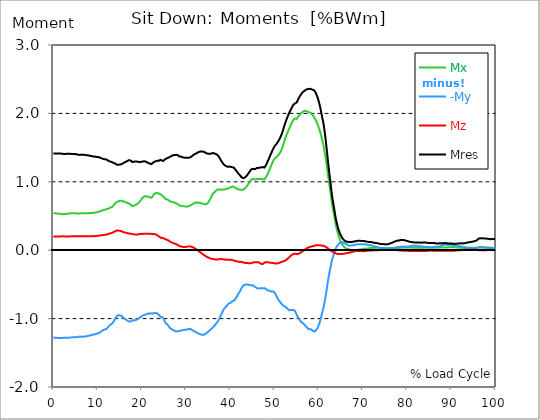
| Category |  Mx |  -My |  Mz |  Mres |
|---|---|---|---|---|
| 0.0 | 0.541 | -1.276 | 0.201 | 1.412 |
| 0.167348456675344 | 0.541 | -1.279 | 0.201 | 1.413 |
| 0.334696913350688 | 0.539 | -1.279 | 0.201 | 1.413 |
| 0.5020453700260321 | 0.538 | -1.28 | 0.201 | 1.413 |
| 0.669393826701376 | 0.538 | -1.279 | 0.201 | 1.412 |
| 0.83674228337672 | 0.538 | -1.28 | 0.201 | 1.413 |
| 1.0040907400520642 | 0.537 | -1.284 | 0.201 | 1.415 |
| 1.1621420602454444 | 0.534 | -1.284 | 0.201 | 1.415 |
| 1.3294905169207885 | 0.534 | -1.284 | 0.201 | 1.414 |
| 1.4968389735961325 | 0.533 | -1.284 | 0.201 | 1.414 |
| 1.6641874302714765 | 0.531 | -1.284 | 0.201 | 1.413 |
| 1.8315358869468206 | 0.527 | -1.284 | 0.201 | 1.412 |
| 1.9988843436221646 | 0.526 | -1.283 | 0.203 | 1.409 |
| 2.1662328002975086 | 0.526 | -1.281 | 0.203 | 1.408 |
| 2.333581256972853 | 0.528 | -1.281 | 0.203 | 1.408 |
| 2.5009297136481967 | 0.529 | -1.28 | 0.201 | 1.408 |
| 2.6682781703235405 | 0.529 | -1.279 | 0.201 | 1.407 |
| 2.8356266269988843 | 0.531 | -1.279 | 0.2 | 1.408 |
| 3.002975083674229 | 0.532 | -1.281 | 0.2 | 1.409 |
| 3.1703235403495724 | 0.534 | -1.28 | 0.2 | 1.409 |
| 3.337671997024917 | 0.534 | -1.279 | 0.201 | 1.409 |
| 3.4957233172182973 | 0.537 | -1.279 | 0.201 | 1.409 |
| 3.663071773893641 | 0.538 | -1.279 | 0.201 | 1.409 |
| 3.8304202305689854 | 0.539 | -1.278 | 0.201 | 1.408 |
| 3.997768687244329 | 0.541 | -1.275 | 0.203 | 1.408 |
| 4.165117143919673 | 0.542 | -1.274 | 0.203 | 1.407 |
| 4.332465600595017 | 0.541 | -1.273 | 0.203 | 1.405 |
| 4.499814057270361 | 0.541 | -1.273 | 0.203 | 1.404 |
| 4.667162513945706 | 0.539 | -1.274 | 0.203 | 1.405 |
| 4.834510970621049 | 0.539 | -1.274 | 0.203 | 1.405 |
| 5.001859427296393 | 0.538 | -1.274 | 0.203 | 1.405 |
| 5.169207883971737 | 0.537 | -1.274 | 0.203 | 1.404 |
| 5.336556340647081 | 0.537 | -1.27 | 0.203 | 1.4 |
| 5.503904797322425 | 0.536 | -1.267 | 0.204 | 1.398 |
| 5.671253253997769 | 0.536 | -1.265 | 0.204 | 1.396 |
| 5.82930457419115 | 0.536 | -1.264 | 0.203 | 1.394 |
| 5.996653030866494 | 0.536 | -1.263 | 0.203 | 1.393 |
| 6.164001487541838 | 0.539 | -1.263 | 0.203 | 1.394 |
| 6.331349944217181 | 0.541 | -1.264 | 0.203 | 1.397 |
| 6.498698400892526 | 0.541 | -1.265 | 0.204 | 1.398 |
| 6.66604685756787 | 0.539 | -1.264 | 0.204 | 1.396 |
| 6.833395314243213 | 0.539 | -1.263 | 0.204 | 1.394 |
| 7.000743770918558 | 0.539 | -1.264 | 0.204 | 1.396 |
| 7.168092227593902 | 0.538 | -1.262 | 0.204 | 1.393 |
| 7.335440684269246 | 0.539 | -1.257 | 0.204 | 1.389 |
| 7.50278914094459 | 0.541 | -1.256 | 0.204 | 1.388 |
| 7.6701375976199335 | 0.542 | -1.257 | 0.204 | 1.389 |
| 7.837486054295278 | 0.542 | -1.256 | 0.204 | 1.388 |
| 7.995537374488658 | 0.542 | -1.251 | 0.204 | 1.385 |
| 8.162885831164003 | 0.543 | -1.246 | 0.204 | 1.381 |
| 8.330234287839346 | 0.543 | -1.244 | 0.204 | 1.38 |
| 8.49758274451469 | 0.544 | -1.246 | 0.203 | 1.381 |
| 8.664931201190035 | 0.544 | -1.242 | 0.204 | 1.377 |
| 8.832279657865378 | 0.544 | -1.236 | 0.205 | 1.372 |
| 8.999628114540721 | 0.545 | -1.232 | 0.206 | 1.369 |
| 9.166976571216066 | 0.548 | -1.233 | 0.205 | 1.371 |
| 9.334325027891412 | 0.549 | -1.233 | 0.205 | 1.371 |
| 9.501673484566755 | 0.55 | -1.229 | 0.206 | 1.367 |
| 9.669021941242098 | 0.553 | -1.222 | 0.209 | 1.364 |
| 9.836370397917442 | 0.557 | -1.219 | 0.21 | 1.361 |
| 10.003718854592787 | 0.56 | -1.216 | 0.21 | 1.361 |
| 10.17106731126813 | 0.563 | -1.215 | 0.211 | 1.361 |
| 10.329118631461512 | 0.564 | -1.213 | 0.213 | 1.36 |
| 10.496467088136853 | 0.568 | -1.204 | 0.215 | 1.354 |
| 10.663815544812199 | 0.571 | -1.195 | 0.216 | 1.349 |
| 10.831164001487544 | 0.576 | -1.189 | 0.217 | 1.346 |
| 10.998512458162887 | 0.58 | -1.182 | 0.22 | 1.342 |
| 11.16586091483823 | 0.584 | -1.174 | 0.221 | 1.338 |
| 11.333209371513574 | 0.587 | -1.166 | 0.224 | 1.333 |
| 11.50055782818892 | 0.59 | -1.165 | 0.224 | 1.332 |
| 11.667906284864264 | 0.593 | -1.158 | 0.225 | 1.329 |
| 11.835254741539607 | 0.597 | -1.156 | 0.225 | 1.329 |
| 12.00260319821495 | 0.598 | -1.15 | 0.229 | 1.327 |
| 12.169951654890292 | 0.601 | -1.141 | 0.231 | 1.319 |
| 12.337300111565641 | 0.606 | -1.129 | 0.235 | 1.312 |
| 12.504648568240984 | 0.612 | -1.114 | 0.238 | 1.306 |
| 12.662699888434362 | 0.617 | -1.101 | 0.242 | 1.3 |
| 12.830048345109708 | 0.62 | -1.092 | 0.244 | 1.295 |
| 12.997396801785053 | 0.627 | -1.086 | 0.248 | 1.294 |
| 13.164745258460396 | 0.631 | -1.079 | 0.251 | 1.29 |
| 13.33209371513574 | 0.635 | -1.069 | 0.256 | 1.285 |
| 13.499442171811083 | 0.644 | -1.054 | 0.262 | 1.28 |
| 13.666790628486426 | 0.66 | -1.036 | 0.268 | 1.274 |
| 13.834139085161771 | 0.676 | -1.018 | 0.273 | 1.27 |
| 14.001487541837117 | 0.687 | -1.001 | 0.278 | 1.265 |
| 14.16883599851246 | 0.695 | -0.982 | 0.283 | 1.257 |
| 14.336184455187803 | 0.701 | -0.964 | 0.287 | 1.251 |
| 14.503532911863147 | 0.71 | -0.952 | 0.287 | 1.248 |
| 14.670881368538492 | 0.715 | -0.951 | 0.289 | 1.249 |
| 14.828932688731873 | 0.719 | -0.95 | 0.289 | 1.251 |
| 14.996281145407215 | 0.721 | -0.952 | 0.283 | 1.252 |
| 15.163629602082558 | 0.722 | -0.948 | 0.284 | 1.252 |
| 15.330978058757903 | 0.72 | -0.957 | 0.28 | 1.256 |
| 15.498326515433247 | 0.72 | -0.964 | 0.275 | 1.259 |
| 15.665674972108594 | 0.719 | -0.977 | 0.269 | 1.267 |
| 15.833023428783937 | 0.713 | -0.99 | 0.262 | 1.276 |
| 16.00037188545928 | 0.709 | -0.998 | 0.26 | 1.281 |
| 16.167720342134626 | 0.708 | -1.004 | 0.26 | 1.286 |
| 16.335068798809967 | 0.701 | -1.012 | 0.257 | 1.29 |
| 16.502417255485312 | 0.698 | -1.016 | 0.254 | 1.295 |
| 16.669765712160658 | 0.693 | -1.027 | 0.251 | 1.302 |
| 16.837114168836 | 0.688 | -1.036 | 0.248 | 1.308 |
| 17.004462625511344 | 0.686 | -1.039 | 0.246 | 1.313 |
| 17.16251394570472 | 0.681 | -1.045 | 0.243 | 1.318 |
| 17.32986240238007 | 0.673 | -1.043 | 0.242 | 1.313 |
| 17.497210859055414 | 0.666 | -1.041 | 0.241 | 1.308 |
| 17.664559315730756 | 0.658 | -1.037 | 0.24 | 1.303 |
| 17.8319077724061 | 0.645 | -1.027 | 0.235 | 1.289 |
| 17.999256229081443 | 0.644 | -1.023 | 0.233 | 1.289 |
| 18.166604685756788 | 0.649 | -1.026 | 0.233 | 1.292 |
| 18.333953142432133 | 0.656 | -1.027 | 0.231 | 1.296 |
| 18.501301599107478 | 0.661 | -1.022 | 0.231 | 1.297 |
| 18.668650055782823 | 0.666 | -1.02 | 0.23 | 1.296 |
| 18.835998512458165 | 0.67 | -1.017 | 0.227 | 1.296 |
| 19.00334696913351 | 0.676 | -1.011 | 0.23 | 1.295 |
| 19.170695425808855 | 0.686 | -1.002 | 0.232 | 1.292 |
| 19.338043882484197 | 0.695 | -0.993 | 0.235 | 1.29 |
| 19.496095202677576 | 0.706 | -0.982 | 0.237 | 1.287 |
| 19.66344365935292 | 0.716 | -0.979 | 0.236 | 1.29 |
| 19.830792116028263 | 0.735 | -0.972 | 0.238 | 1.292 |
| 19.998140572703612 | 0.754 | -0.964 | 0.24 | 1.294 |
| 20.165489029378953 | 0.764 | -0.958 | 0.24 | 1.296 |
| 20.3328374860543 | 0.774 | -0.952 | 0.238 | 1.299 |
| 20.500185942729644 | 0.785 | -0.947 | 0.24 | 1.301 |
| 20.667534399404985 | 0.79 | -0.945 | 0.24 | 1.301 |
| 20.83488285608033 | 0.791 | -0.941 | 0.241 | 1.296 |
| 21.002231312755672 | 0.789 | -0.936 | 0.24 | 1.29 |
| 21.16957976943102 | 0.786 | -0.93 | 0.241 | 1.284 |
| 21.336928226106362 | 0.783 | -0.928 | 0.242 | 1.279 |
| 21.504276682781704 | 0.781 | -0.926 | 0.242 | 1.276 |
| 21.67162513945705 | 0.779 | -0.925 | 0.242 | 1.27 |
| 21.82967645965043 | 0.771 | -0.925 | 0.241 | 1.264 |
| 21.997024916325774 | 0.765 | -0.924 | 0.24 | 1.259 |
| 22.16437337300112 | 0.764 | -0.924 | 0.24 | 1.258 |
| 22.33172182967646 | 0.775 | -0.928 | 0.237 | 1.267 |
| 22.499070286351806 | 0.794 | -0.926 | 0.236 | 1.278 |
| 22.666418743027148 | 0.816 | -0.921 | 0.236 | 1.29 |
| 22.833767199702496 | 0.824 | -0.916 | 0.237 | 1.294 |
| 23.00111565637784 | 0.83 | -0.915 | 0.233 | 1.297 |
| 23.168464113053183 | 0.835 | -0.918 | 0.23 | 1.301 |
| 23.335812569728528 | 0.839 | -0.92 | 0.226 | 1.305 |
| 23.50316102640387 | 0.839 | -0.925 | 0.22 | 1.308 |
| 23.670509483079215 | 0.834 | -0.935 | 0.21 | 1.31 |
| 23.83785793975456 | 0.828 | -0.936 | 0.204 | 1.306 |
| 23.995909259947936 | 0.821 | -0.951 | 0.197 | 1.311 |
| 24.163257716623285 | 0.821 | -0.972 | 0.188 | 1.321 |
| 24.330606173298627 | 0.816 | -0.983 | 0.181 | 1.323 |
| 24.49795462997397 | 0.805 | -0.978 | 0.178 | 1.313 |
| 24.665303086649313 | 0.791 | -0.979 | 0.177 | 1.305 |
| 24.83265154332466 | 0.781 | -0.989 | 0.176 | 1.305 |
| 25.0 | 0.775 | -1.009 | 0.173 | 1.313 |
| 25.167348456675345 | 0.762 | -1.041 | 0.165 | 1.326 |
| 25.334696913350694 | 0.751 | -1.059 | 0.16 | 1.333 |
| 25.502045370026035 | 0.748 | -1.072 | 0.156 | 1.339 |
| 25.669393826701377 | 0.744 | -1.079 | 0.154 | 1.342 |
| 25.836742283376722 | 0.74 | -1.09 | 0.149 | 1.346 |
| 26.004090740052067 | 0.733 | -1.103 | 0.144 | 1.353 |
| 26.17143919672741 | 0.724 | -1.119 | 0.136 | 1.359 |
| 26.329490516920792 | 0.715 | -1.134 | 0.128 | 1.365 |
| 26.49683897359613 | 0.711 | -1.143 | 0.12 | 1.371 |
| 26.66418743027148 | 0.709 | -1.151 | 0.115 | 1.376 |
| 26.831535886946828 | 0.706 | -1.158 | 0.112 | 1.381 |
| 26.998884343622166 | 0.705 | -1.166 | 0.107 | 1.386 |
| 27.166232800297514 | 0.703 | -1.171 | 0.103 | 1.389 |
| 27.333581256972852 | 0.698 | -1.176 | 0.098 | 1.389 |
| 27.5009297136482 | 0.692 | -1.181 | 0.095 | 1.392 |
| 27.668278170323543 | 0.688 | -1.186 | 0.091 | 1.394 |
| 27.835626626998888 | 0.686 | -1.188 | 0.087 | 1.394 |
| 28.002975083674233 | 0.679 | -1.188 | 0.081 | 1.392 |
| 28.170323540349575 | 0.671 | -1.188 | 0.075 | 1.387 |
| 28.33767199702492 | 0.661 | -1.181 | 0.068 | 1.376 |
| 28.50502045370026 | 0.655 | -1.177 | 0.061 | 1.37 |
| 28.663071773893645 | 0.651 | -1.177 | 0.057 | 1.369 |
| 28.830420230568986 | 0.651 | -1.177 | 0.054 | 1.369 |
| 28.99776868724433 | 0.649 | -1.174 | 0.053 | 1.365 |
| 29.165117143919673 | 0.645 | -1.17 | 0.049 | 1.359 |
| 29.33246560059502 | 0.643 | -1.166 | 0.048 | 1.355 |
| 29.499814057270367 | 0.641 | -1.165 | 0.047 | 1.354 |
| 29.66716251394571 | 0.641 | -1.163 | 0.047 | 1.353 |
| 29.834510970621054 | 0.639 | -1.163 | 0.048 | 1.353 |
| 30.00185942729639 | 0.636 | -1.162 | 0.049 | 1.351 |
| 30.169207883971744 | 0.636 | -1.161 | 0.05 | 1.351 |
| 30.33655634064708 | 0.638 | -1.157 | 0.053 | 1.351 |
| 30.50390479732243 | 0.643 | -1.154 | 0.055 | 1.35 |
| 30.671253253997772 | 0.646 | -1.151 | 0.057 | 1.351 |
| 30.829304574191156 | 0.651 | -1.152 | 0.055 | 1.355 |
| 30.996653030866494 | 0.656 | -1.154 | 0.054 | 1.359 |
| 31.164001487541842 | 0.662 | -1.16 | 0.052 | 1.366 |
| 31.331349944217187 | 0.667 | -1.166 | 0.048 | 1.373 |
| 31.498698400892525 | 0.674 | -1.172 | 0.044 | 1.383 |
| 31.666046857567874 | 0.682 | -1.179 | 0.039 | 1.392 |
| 31.833395314243212 | 0.689 | -1.186 | 0.034 | 1.4 |
| 32.00074377091856 | 0.692 | -1.19 | 0.027 | 1.405 |
| 32.1680922275939 | 0.695 | -1.195 | 0.02 | 1.412 |
| 32.33544068426925 | 0.697 | -1.201 | 0.012 | 1.416 |
| 32.50278914094459 | 0.694 | -1.208 | 0.004 | 1.423 |
| 32.670137597619934 | 0.695 | -1.214 | -0.004 | 1.429 |
| 32.83748605429528 | 0.695 | -1.22 | -0.012 | 1.435 |
| 33.004834510970625 | 0.695 | -1.226 | -0.02 | 1.44 |
| 33.162885831164004 | 0.692 | -1.23 | -0.028 | 1.441 |
| 33.33023428783935 | 0.688 | -1.232 | -0.036 | 1.442 |
| 33.497582744514695 | 0.684 | -1.236 | -0.044 | 1.443 |
| 33.664931201190036 | 0.681 | -1.237 | -0.052 | 1.442 |
| 33.83227965786538 | 0.678 | -1.237 | -0.06 | 1.441 |
| 33.99962811454073 | 0.674 | -1.237 | -0.068 | 1.44 |
| 34.16697657121607 | 0.672 | -1.235 | -0.075 | 1.436 |
| 34.33432502789141 | 0.672 | -1.226 | -0.082 | 1.428 |
| 34.50167348456676 | 0.672 | -1.219 | -0.088 | 1.42 |
| 34.6690219412421 | 0.677 | -1.21 | -0.096 | 1.415 |
| 34.83637039791744 | 0.684 | -1.201 | -0.102 | 1.413 |
| 35.00371885459279 | 0.695 | -1.193 | -0.107 | 1.41 |
| 35.17106731126814 | 0.713 | -1.183 | -0.112 | 1.408 |
| 35.338415767943474 | 0.732 | -1.173 | -0.115 | 1.408 |
| 35.49646708813686 | 0.753 | -1.166 | -0.119 | 1.412 |
| 35.6638155448122 | 0.773 | -1.154 | -0.123 | 1.412 |
| 35.831164001487544 | 0.796 | -1.143 | -0.125 | 1.415 |
| 35.998512458162885 | 0.818 | -1.131 | -0.128 | 1.419 |
| 36.165860914838234 | 0.835 | -1.12 | -0.13 | 1.421 |
| 36.333209371513576 | 0.845 | -1.111 | -0.133 | 1.418 |
| 36.50055782818892 | 0.851 | -1.098 | -0.134 | 1.412 |
| 36.667906284864266 | 0.866 | -1.085 | -0.136 | 1.409 |
| 36.83525474153961 | 0.877 | -1.071 | -0.136 | 1.404 |
| 37.002603198214956 | 0.882 | -1.057 | -0.136 | 1.396 |
| 37.1699516548903 | 0.887 | -1.042 | -0.136 | 1.387 |
| 37.337300111565646 | 0.887 | -1.025 | -0.134 | 1.373 |
| 37.50464856824098 | 0.887 | -1.006 | -0.131 | 1.359 |
| 37.66269988843437 | 0.888 | -0.984 | -0.13 | 1.343 |
| 37.83004834510971 | 0.886 | -0.958 | -0.13 | 1.322 |
| 37.99739680178505 | 0.885 | -0.934 | -0.13 | 1.302 |
| 38.16474525846039 | 0.887 | -0.912 | -0.13 | 1.286 |
| 38.33209371513574 | 0.887 | -0.888 | -0.133 | 1.27 |
| 38.49944217181109 | 0.886 | -0.866 | -0.134 | 1.254 |
| 38.666790628486424 | 0.888 | -0.854 | -0.135 | 1.247 |
| 38.83413908516178 | 0.891 | -0.839 | -0.136 | 1.238 |
| 39.001487541837115 | 0.892 | -0.826 | -0.138 | 1.231 |
| 39.16883599851246 | 0.893 | -0.816 | -0.139 | 1.226 |
| 39.336184455187805 | 0.899 | -0.801 | -0.14 | 1.222 |
| 39.503532911863154 | 0.905 | -0.787 | -0.141 | 1.219 |
| 39.670881368538495 | 0.909 | -0.778 | -0.141 | 1.216 |
| 39.83822982521384 | 0.916 | -0.781 | -0.141 | 1.225 |
| 39.996281145407224 | 0.918 | -0.773 | -0.141 | 1.22 |
| 40.163629602082565 | 0.921 | -0.762 | -0.14 | 1.216 |
| 40.33097805875791 | 0.926 | -0.753 | -0.141 | 1.215 |
| 40.498326515433256 | 0.93 | -0.744 | -0.144 | 1.214 |
| 40.6656749721086 | 0.931 | -0.738 | -0.149 | 1.21 |
| 40.83302342878393 | 0.926 | -0.736 | -0.152 | 1.205 |
| 41.00037188545929 | 0.915 | -0.73 | -0.155 | 1.193 |
| 41.16772034213463 | 0.908 | -0.709 | -0.16 | 1.176 |
| 41.33506879880997 | 0.903 | -0.694 | -0.161 | 1.163 |
| 41.50241725548531 | 0.898 | -0.677 | -0.162 | 1.15 |
| 41.66976571216066 | 0.893 | -0.656 | -0.165 | 1.134 |
| 41.837114168836 | 0.889 | -0.635 | -0.17 | 1.12 |
| 42.004462625511344 | 0.887 | -0.618 | -0.171 | 1.109 |
| 42.17181108218669 | 0.885 | -0.602 | -0.171 | 1.098 |
| 42.32986240238007 | 0.883 | -0.584 | -0.17 | 1.085 |
| 42.497210859055414 | 0.883 | -0.559 | -0.171 | 1.07 |
| 42.66455931573076 | 0.883 | -0.541 | -0.173 | 1.061 |
| 42.831907772406105 | 0.885 | -0.526 | -0.177 | 1.055 |
| 42.999256229081446 | 0.888 | -0.516 | -0.181 | 1.054 |
| 43.16660468575679 | 0.897 | -0.507 | -0.184 | 1.058 |
| 43.33395314243214 | 0.905 | -0.501 | -0.187 | 1.064 |
| 43.50130159910748 | 0.916 | -0.502 | -0.186 | 1.074 |
| 43.66865005578282 | 0.929 | -0.501 | -0.186 | 1.085 |
| 43.83599851245817 | 0.945 | -0.5 | -0.188 | 1.098 |
| 44.00334696913351 | 0.959 | -0.498 | -0.189 | 1.111 |
| 44.17069542580886 | 0.975 | -0.505 | -0.189 | 1.128 |
| 44.3380438824842 | 0.991 | -0.51 | -0.189 | 1.145 |
| 44.49609520267758 | 1.009 | -0.51 | -0.19 | 1.16 |
| 44.66344365935292 | 1.026 | -0.515 | -0.192 | 1.176 |
| 44.83079211602827 | 1.036 | -0.517 | -0.19 | 1.186 |
| 44.99814057270361 | 1.041 | -0.517 | -0.184 | 1.189 |
| 45.16548902937895 | 1.042 | -0.512 | -0.178 | 1.187 |
| 45.332837486054295 | 1.038 | -0.522 | -0.176 | 1.186 |
| 45.500185942729644 | 1.036 | -0.531 | -0.176 | 1.186 |
| 45.66753439940499 | 1.033 | -0.538 | -0.177 | 1.187 |
| 45.83488285608033 | 1.038 | -0.545 | -0.177 | 1.193 |
| 46.00223131275568 | 1.042 | -0.557 | -0.174 | 1.201 |
| 46.16957976943102 | 1.043 | -0.559 | -0.176 | 1.205 |
| 46.336928226106366 | 1.039 | -0.558 | -0.177 | 1.203 |
| 46.50427668278171 | 1.037 | -0.559 | -0.182 | 1.204 |
| 46.671625139457056 | 1.039 | -0.557 | -0.188 | 1.208 |
| 46.829676459650436 | 1.039 | -0.555 | -0.194 | 1.209 |
| 46.99702491632577 | 1.037 | -0.557 | -0.2 | 1.21 |
| 47.16437337300112 | 1.037 | -0.558 | -0.204 | 1.213 |
| 47.33172182967646 | 1.039 | -0.559 | -0.2 | 1.216 |
| 47.49907028635181 | 1.036 | -0.555 | -0.194 | 1.211 |
| 47.66641874302716 | 1.034 | -0.549 | -0.186 | 1.208 |
| 47.83376719970249 | 1.044 | -0.557 | -0.179 | 1.22 |
| 48.001115656377834 | 1.059 | -0.563 | -0.174 | 1.235 |
| 48.16846411305319 | 1.076 | -0.572 | -0.174 | 1.257 |
| 48.33581256972853 | 1.1 | -0.58 | -0.177 | 1.281 |
| 48.50316102640387 | 1.123 | -0.587 | -0.177 | 1.306 |
| 48.67050948307921 | 1.146 | -0.586 | -0.178 | 1.327 |
| 48.837857939754564 | 1.171 | -0.592 | -0.184 | 1.354 |
| 49.005206396429905 | 1.197 | -0.6 | -0.184 | 1.381 |
| 49.163257716623285 | 1.224 | -0.603 | -0.183 | 1.405 |
| 49.33060617329863 | 1.249 | -0.602 | -0.183 | 1.428 |
| 49.49795462997397 | 1.276 | -0.603 | -0.186 | 1.455 |
| 49.66530308664932 | 1.3 | -0.603 | -0.188 | 1.477 |
| 49.832651543324666 | 1.319 | -0.606 | -0.189 | 1.496 |
| 50.0 | 1.338 | -0.617 | -0.19 | 1.518 |
| 50.16734845667534 | 1.348 | -0.635 | -0.192 | 1.533 |
| 50.33469691335069 | 1.355 | -0.656 | -0.194 | 1.543 |
| 50.50204537002604 | 1.364 | -0.681 | -0.194 | 1.558 |
| 50.66939382670139 | 1.375 | -0.701 | -0.193 | 1.574 |
| 50.836742283376715 | 1.387 | -0.719 | -0.189 | 1.592 |
| 51.00409074005207 | 1.4 | -0.733 | -0.187 | 1.609 |
| 51.17143919672741 | 1.416 | -0.747 | -0.183 | 1.629 |
| 51.32949051692079 | 1.436 | -0.762 | -0.179 | 1.652 |
| 51.496838973596134 | 1.457 | -0.775 | -0.174 | 1.677 |
| 51.66418743027148 | 1.482 | -0.789 | -0.17 | 1.704 |
| 51.831535886946824 | 1.51 | -0.8 | -0.166 | 1.736 |
| 51.99888434362217 | 1.545 | -0.812 | -0.163 | 1.773 |
| 52.16623280029752 | 1.58 | -0.816 | -0.16 | 1.807 |
| 52.33358125697285 | 1.615 | -0.823 | -0.155 | 1.843 |
| 52.5009297136482 | 1.647 | -0.83 | -0.149 | 1.873 |
| 52.668278170323546 | 1.676 | -0.837 | -0.14 | 1.903 |
| 52.835626626998895 | 1.703 | -0.849 | -0.131 | 1.931 |
| 53.00297508367424 | 1.729 | -0.86 | -0.123 | 1.958 |
| 53.17032354034958 | 1.753 | -0.872 | -0.113 | 1.985 |
| 53.33767199702492 | 1.778 | -0.878 | -0.103 | 2.011 |
| 53.50502045370027 | 1.801 | -0.875 | -0.091 | 2.031 |
| 53.663071773893655 | 1.824 | -0.875 | -0.081 | 2.053 |
| 53.83042023056899 | 1.85 | -0.875 | -0.072 | 2.075 |
| 53.99776868724433 | 1.873 | -0.875 | -0.065 | 2.096 |
| 54.16511714391967 | 1.893 | -0.875 | -0.06 | 2.115 |
| 54.33246560059503 | 1.912 | -0.875 | -0.055 | 2.13 |
| 54.49981405727037 | 1.924 | -0.878 | -0.052 | 2.143 |
| 54.667162513945705 | 1.926 | -0.892 | -0.05 | 2.147 |
| 54.834510970621054 | 1.921 | -0.919 | -0.054 | 2.152 |
| 55.0018594272964 | 1.92 | -0.941 | -0.058 | 2.16 |
| 55.169207883971744 | 1.932 | -0.964 | -0.058 | 2.181 |
| 55.336556340647086 | 1.95 | -0.985 | -0.057 | 2.204 |
| 55.50390479732243 | 1.964 | -1.002 | -0.052 | 2.226 |
| 55.671253253997776 | 1.977 | -1.018 | -0.044 | 2.244 |
| 55.83860171067312 | 1.99 | -1.033 | -0.038 | 2.262 |
| 55.9966530308665 | 2.001 | -1.041 | -0.031 | 2.278 |
| 56.16400148754184 | 2.012 | -1.057 | -0.023 | 2.294 |
| 56.33134994421718 | 2.022 | -1.063 | -0.016 | 2.306 |
| 56.498698400892536 | 2.027 | -1.07 | -0.007 | 2.316 |
| 56.66604685756788 | 2.032 | -1.079 | 0.001 | 2.326 |
| 56.83339531424321 | 2.034 | -1.092 | 0.009 | 2.334 |
| 57.00074377091856 | 2.036 | -1.108 | 0.016 | 2.343 |
| 57.16809222759391 | 2.033 | -1.119 | 0.023 | 2.348 |
| 57.33544068426925 | 2.031 | -1.129 | 0.029 | 2.351 |
| 57.5027891409446 | 2.026 | -1.141 | 0.036 | 2.355 |
| 57.670137597619934 | 2.02 | -1.154 | 0.041 | 2.357 |
| 57.83748605429528 | 2.015 | -1.157 | 0.045 | 2.357 |
| 58.004834510970625 | 2.014 | -1.151 | 0.048 | 2.359 |
| 58.16288583116401 | 2.01 | -1.156 | 0.05 | 2.36 |
| 58.330234287839346 | 2 | -1.162 | 0.053 | 2.357 |
| 58.497582744514695 | 1.985 | -1.162 | 0.057 | 2.348 |
| 58.66493120119004 | 1.971 | -1.177 | 0.059 | 2.346 |
| 58.832279657865385 | 1.956 | -1.186 | 0.061 | 2.343 |
| 58.999628114540734 | 1.942 | -1.189 | 0.065 | 2.335 |
| 59.16697657121607 | 1.923 | -1.184 | 0.068 | 2.319 |
| 59.33432502789142 | 1.9 | -1.176 | 0.071 | 2.299 |
| 59.50167348456676 | 1.877 | -1.165 | 0.074 | 2.274 |
| 59.66902194124211 | 1.853 | -1.146 | 0.074 | 2.247 |
| 59.83637039791745 | 1.826 | -1.123 | 0.074 | 2.214 |
| 60.00371885459278 | 1.796 | -1.096 | 0.072 | 2.177 |
| 60.17106731126813 | 1.764 | -1.065 | 0.071 | 2.136 |
| 60.33841576794349 | 1.727 | -1.028 | 0.071 | 2.091 |
| 60.49646708813685 | 1.688 | -0.988 | 0.07 | 2.038 |
| 60.6638155448122 | 1.644 | -0.943 | 0.069 | 1.982 |
| 60.831164001487544 | 1.598 | -0.9 | 0.068 | 1.926 |
| 60.99851245816289 | 1.555 | -0.864 | 0.065 | 1.878 |
| 61.16586091483824 | 1.501 | -0.812 | 0.061 | 1.812 |
| 61.333209371513576 | 1.44 | -0.756 | 0.057 | 1.736 |
| 61.50055782818892 | 1.375 | -0.695 | 0.052 | 1.652 |
| 61.667906284864266 | 1.303 | -0.628 | 0.045 | 1.557 |
| 61.835254741539615 | 1.229 | -0.56 | 0.038 | 1.459 |
| 62.002603198214956 | 1.147 | -0.485 | 0.029 | 1.355 |
| 62.16995165489029 | 1.069 | -0.418 | 0.021 | 1.256 |
| 62.33730011156564 | 0.99 | -0.355 | 0.012 | 1.161 |
| 62.504648568240995 | 0.914 | -0.297 | 0.004 | 1.07 |
| 62.67199702491633 | 0.842 | -0.251 | -0.004 | 0.989 |
| 62.83004834510971 | 0.756 | -0.19 | -0.011 | 0.887 |
| 62.99739680178505 | 0.683 | -0.145 | -0.017 | 0.805 |
| 63.1647452584604 | 0.618 | -0.107 | -0.023 | 0.732 |
| 63.33209371513575 | 0.558 | -0.076 | -0.029 | 0.667 |
| 63.4994421718111 | 0.498 | -0.041 | -0.036 | 0.601 |
| 63.666790628486424 | 0.44 | -0.012 | -0.041 | 0.538 |
| 63.83413908516177 | 0.38 | 0.02 | -0.045 | 0.473 |
| 64.00148754183712 | 0.332 | 0.044 | -0.05 | 0.421 |
| 64.16883599851248 | 0.289 | 0.061 | -0.053 | 0.376 |
| 64.3361844551878 | 0.247 | 0.075 | -0.054 | 0.333 |
| 64.50353291186315 | 0.211 | 0.087 | -0.055 | 0.299 |
| 64.6708813685385 | 0.174 | 0.104 | -0.055 | 0.267 |
| 64.83822982521384 | 0.146 | 0.108 | -0.057 | 0.24 |
| 65.00557828188919 | 0.12 | 0.114 | -0.055 | 0.216 |
| 65.16362960208257 | 0.1 | 0.115 | -0.055 | 0.195 |
| 65.3309780587579 | 0.081 | 0.115 | -0.054 | 0.177 |
| 65.49832651543326 | 0.066 | 0.111 | -0.053 | 0.162 |
| 65.6656749721086 | 0.053 | 0.106 | -0.052 | 0.15 |
| 65.83302342878395 | 0.042 | 0.102 | -0.049 | 0.14 |
| 66.00037188545929 | 0.033 | 0.097 | -0.047 | 0.133 |
| 66.16772034213463 | 0.028 | 0.091 | -0.045 | 0.128 |
| 66.33506879880998 | 0.023 | 0.084 | -0.043 | 0.123 |
| 66.50241725548531 | 0.02 | 0.076 | -0.042 | 0.123 |
| 66.66976571216065 | 0.016 | 0.071 | -0.039 | 0.12 |
| 66.83711416883601 | 0.012 | 0.069 | -0.037 | 0.119 |
| 67.00446262551135 | 0.01 | 0.066 | -0.036 | 0.117 |
| 67.1718110821867 | 0.005 | 0.068 | -0.032 | 0.118 |
| 67.32986240238007 | 0.002 | 0.069 | -0.029 | 0.118 |
| 67.49721085905541 | 0.001 | 0.071 | -0.026 | 0.12 |
| 67.66455931573076 | 0.001 | 0.07 | -0.023 | 0.124 |
| 67.83190777240611 | 0.002 | 0.071 | -0.021 | 0.125 |
| 67.99925622908145 | 0.001 | 0.077 | -0.017 | 0.128 |
| 68.16660468575678 | 0 | 0.079 | -0.015 | 0.129 |
| 68.33395314243214 | 0 | 0.081 | -0.012 | 0.13 |
| 68.50130159910749 | 0.002 | 0.085 | -0.011 | 0.133 |
| 68.66865005578282 | 0.004 | 0.085 | -0.01 | 0.135 |
| 68.83599851245816 | 0.006 | 0.084 | -0.011 | 0.138 |
| 69.00334696913352 | 0.009 | 0.086 | -0.012 | 0.139 |
| 69.17069542580886 | 0.011 | 0.086 | -0.014 | 0.139 |
| 69.3380438824842 | 0.011 | 0.087 | -0.014 | 0.136 |
| 69.50539233915956 | 0.011 | 0.088 | -0.012 | 0.136 |
| 69.66344365935292 | 0.014 | 0.087 | -0.012 | 0.135 |
| 69.83079211602826 | 0.017 | 0.085 | -0.014 | 0.135 |
| 69.99814057270362 | 0.018 | 0.085 | -0.015 | 0.134 |
| 70.16548902937896 | 0.021 | 0.086 | -0.016 | 0.134 |
| 70.33283748605429 | 0.021 | 0.087 | -0.014 | 0.134 |
| 70.50018594272964 | 0.021 | 0.087 | -0.012 | 0.131 |
| 70.667534399405 | 0.023 | 0.084 | -0.01 | 0.129 |
| 70.83488285608033 | 0.026 | 0.08 | -0.01 | 0.125 |
| 71.00223131275568 | 0.027 | 0.079 | -0.009 | 0.124 |
| 71.16957976943102 | 0.026 | 0.076 | -0.006 | 0.122 |
| 71.33692822610637 | 0.028 | 0.072 | -0.006 | 0.12 |
| 71.50427668278171 | 0.031 | 0.074 | -0.006 | 0.122 |
| 71.67162513945706 | 0.032 | 0.075 | -0.005 | 0.122 |
| 71.8389735961324 | 0.032 | 0.072 | -0.005 | 0.12 |
| 71.99702491632577 | 0.033 | 0.068 | -0.004 | 0.115 |
| 72.16437337300113 | 0.033 | 0.063 | -0.004 | 0.113 |
| 72.33172182967647 | 0.033 | 0.061 | -0.002 | 0.113 |
| 72.49907028635181 | 0.033 | 0.058 | -0.001 | 0.109 |
| 72.66641874302715 | 0.034 | 0.054 | -0.001 | 0.107 |
| 72.8337671997025 | 0.034 | 0.053 | 0 | 0.106 |
| 73.00111565637783 | 0.034 | 0.049 | 0 | 0.104 |
| 73.16846411305319 | 0.034 | 0.045 | 0 | 0.103 |
| 73.33581256972853 | 0.034 | 0.042 | 0 | 0.102 |
| 73.50316102640387 | 0.034 | 0.039 | 0 | 0.1 |
| 73.67050948307921 | 0.033 | 0.038 | 0.001 | 0.097 |
| 73.83785793975457 | 0.032 | 0.036 | 0.001 | 0.092 |
| 74.00520639642991 | 0.032 | 0.033 | 0.001 | 0.09 |
| 74.16325771662328 | 0.032 | 0.031 | 0.001 | 0.088 |
| 74.33060617329863 | 0.032 | 0.031 | 0.001 | 0.088 |
| 74.49795462997398 | 0.033 | 0.029 | 0.001 | 0.09 |
| 74.66530308664932 | 0.032 | 0.029 | 0.002 | 0.088 |
| 74.83265154332466 | 0.031 | 0.029 | 0.002 | 0.087 |
| 75.00000000000001 | 0.029 | 0.029 | 0.002 | 0.087 |
| 75.16734845667534 | 0.028 | 0.028 | 0.002 | 0.086 |
| 75.3346969133507 | 0.028 | 0.028 | 0.004 | 0.085 |
| 75.50204537002605 | 0.028 | 0.025 | 0.004 | 0.085 |
| 75.66939382670138 | 0.027 | 0.029 | 0.005 | 0.09 |
| 75.83674228337672 | 0.028 | 0.031 | 0.005 | 0.092 |
| 76.00409074005208 | 0.028 | 0.029 | 0.005 | 0.093 |
| 76.17143919672742 | 0.028 | 0.031 | 0.005 | 0.098 |
| 76.33878765340276 | 0.029 | 0.034 | 0.004 | 0.103 |
| 76.49683897359614 | 0.029 | 0.031 | 0.004 | 0.108 |
| 76.66418743027148 | 0.027 | 0.029 | 0.005 | 0.112 |
| 76.83153588694682 | 0.027 | 0.031 | 0.006 | 0.115 |
| 76.99888434362218 | 0.028 | 0.031 | 0.005 | 0.12 |
| 77.16623280029752 | 0.029 | 0.034 | 0.004 | 0.127 |
| 77.33358125697285 | 0.028 | 0.039 | 0.005 | 0.129 |
| 77.5009297136482 | 0.031 | 0.042 | 0.002 | 0.134 |
| 77.66827817032356 | 0.032 | 0.044 | 0.001 | 0.139 |
| 77.83562662699889 | 0.032 | 0.045 | 0 | 0.141 |
| 78.00297508367423 | 0.032 | 0.048 | 0 | 0.141 |
| 78.17032354034959 | 0.032 | 0.05 | 0 | 0.141 |
| 78.33767199702493 | 0.036 | 0.048 | -0.002 | 0.145 |
| 78.50502045370027 | 0.038 | 0.049 | -0.005 | 0.149 |
| 78.67236891037561 | 0.037 | 0.05 | -0.005 | 0.149 |
| 78.83042023056899 | 0.036 | 0.05 | -0.006 | 0.149 |
| 78.99776868724433 | 0.038 | 0.05 | -0.007 | 0.151 |
| 79.16511714391969 | 0.039 | 0.053 | -0.009 | 0.15 |
| 79.33246560059503 | 0.039 | 0.052 | -0.009 | 0.147 |
| 79.49981405727036 | 0.039 | 0.053 | -0.009 | 0.144 |
| 79.66716251394571 | 0.039 | 0.053 | -0.009 | 0.141 |
| 79.83451097062107 | 0.037 | 0.05 | -0.009 | 0.138 |
| 80.00185942729641 | 0.037 | 0.05 | -0.009 | 0.136 |
| 80.16920788397174 | 0.038 | 0.052 | -0.01 | 0.133 |
| 80.33655634064709 | 0.039 | 0.053 | -0.01 | 0.13 |
| 80.50390479732243 | 0.039 | 0.059 | -0.012 | 0.124 |
| 80.67125325399778 | 0.039 | 0.059 | -0.014 | 0.123 |
| 80.83860171067312 | 0.038 | 0.063 | -0.014 | 0.12 |
| 80.99665303086651 | 0.036 | 0.064 | -0.012 | 0.118 |
| 81.16400148754184 | 0.036 | 0.064 | -0.014 | 0.118 |
| 81.3313499442172 | 0.033 | 0.064 | -0.012 | 0.115 |
| 81.49869840089255 | 0.034 | 0.064 | -0.014 | 0.114 |
| 81.66604685756786 | 0.034 | 0.065 | -0.014 | 0.113 |
| 81.83339531424322 | 0.037 | 0.065 | -0.015 | 0.114 |
| 82.00074377091858 | 0.036 | 0.066 | -0.014 | 0.113 |
| 82.16809222759392 | 0.034 | 0.068 | -0.014 | 0.113 |
| 82.33544068426926 | 0.034 | 0.064 | -0.014 | 0.113 |
| 82.50278914094459 | 0.034 | 0.061 | -0.014 | 0.112 |
| 82.67013759761994 | 0.036 | 0.058 | -0.014 | 0.112 |
| 82.83748605429528 | 0.036 | 0.058 | -0.012 | 0.112 |
| 83.00483451097062 | 0.033 | 0.058 | -0.012 | 0.111 |
| 83.17218296764597 | 0.034 | 0.057 | -0.011 | 0.109 |
| 83.33023428783935 | 0.036 | 0.054 | -0.011 | 0.108 |
| 83.4975827445147 | 0.033 | 0.054 | -0.01 | 0.112 |
| 83.66493120119004 | 0.036 | 0.052 | -0.011 | 0.113 |
| 83.83227965786537 | 0.037 | 0.049 | -0.011 | 0.114 |
| 83.99962811454073 | 0.038 | 0.048 | -0.011 | 0.113 |
| 84.16697657121607 | 0.038 | 0.048 | -0.01 | 0.112 |
| 84.33432502789142 | 0.037 | 0.047 | -0.01 | 0.112 |
| 84.50167348456677 | 0.037 | 0.047 | -0.009 | 0.109 |
| 84.6690219412421 | 0.036 | 0.045 | -0.007 | 0.108 |
| 84.83637039791745 | 0.034 | 0.044 | -0.006 | 0.106 |
| 85.0037188545928 | 0.034 | 0.043 | -0.006 | 0.106 |
| 85.17106731126813 | 0.034 | 0.043 | -0.005 | 0.106 |
| 85.33841576794349 | 0.034 | 0.044 | -0.005 | 0.106 |
| 85.50576422461883 | 0.036 | 0.044 | -0.006 | 0.106 |
| 85.66381554481221 | 0.036 | 0.043 | -0.007 | 0.106 |
| 85.83116400148755 | 0.037 | 0.043 | -0.007 | 0.107 |
| 85.99851245816289 | 0.036 | 0.045 | -0.007 | 0.106 |
| 86.16586091483823 | 0.036 | 0.048 | -0.007 | 0.103 |
| 86.33320937151358 | 0.034 | 0.05 | -0.006 | 0.101 |
| 86.50055782818893 | 0.037 | 0.049 | -0.007 | 0.1 |
| 86.66790628486427 | 0.038 | 0.048 | -0.007 | 0.1 |
| 86.83525474153961 | 0.039 | 0.049 | -0.009 | 0.1 |
| 87.00260319821496 | 0.039 | 0.052 | -0.009 | 0.1 |
| 87.16995165489031 | 0.037 | 0.054 | -0.007 | 0.1 |
| 87.33730011156564 | 0.037 | 0.055 | -0.007 | 0.1 |
| 87.504648568241 | 0.038 | 0.059 | -0.007 | 0.101 |
| 87.67199702491634 | 0.038 | 0.064 | -0.007 | 0.101 |
| 87.83004834510972 | 0.038 | 0.07 | -0.007 | 0.1 |
| 87.99739680178506 | 0.038 | 0.075 | -0.009 | 0.102 |
| 88.1647452584604 | 0.038 | 0.077 | -0.007 | 0.103 |
| 88.33209371513574 | 0.038 | 0.079 | -0.007 | 0.103 |
| 88.49944217181108 | 0.039 | 0.082 | -0.009 | 0.104 |
| 88.66679062848644 | 0.039 | 0.082 | -0.009 | 0.104 |
| 88.83413908516178 | 0.039 | 0.081 | -0.009 | 0.102 |
| 89.00148754183712 | 0.042 | 0.079 | -0.009 | 0.1 |
| 89.16883599851246 | 0.043 | 0.079 | -0.01 | 0.1 |
| 89.33618445518782 | 0.043 | 0.08 | -0.01 | 0.1 |
| 89.50353291186315 | 0.043 | 0.081 | -0.009 | 0.1 |
| 89.6708813685385 | 0.043 | 0.081 | -0.009 | 0.1 |
| 89.83822982521386 | 0.044 | 0.081 | -0.009 | 0.1 |
| 90.00557828188919 | 0.044 | 0.08 | -0.009 | 0.1 |
| 90.16362960208257 | 0.045 | 0.077 | -0.009 | 0.098 |
| 90.3309780587579 | 0.044 | 0.075 | -0.007 | 0.096 |
| 90.49832651543326 | 0.043 | 0.074 | -0.007 | 0.093 |
| 90.66567497210859 | 0.042 | 0.074 | -0.006 | 0.093 |
| 90.83302342878395 | 0.042 | 0.072 | -0.006 | 0.092 |
| 91.00037188545929 | 0.042 | 0.07 | -0.005 | 0.093 |
| 91.16772034213463 | 0.041 | 0.066 | -0.002 | 0.095 |
| 91.33506879880998 | 0.039 | 0.064 | -0.001 | 0.097 |
| 91.50241725548533 | 0.038 | 0.064 | -0.001 | 0.1 |
| 91.66976571216065 | 0.036 | 0.063 | 0 | 0.1 |
| 91.83711416883601 | 0.034 | 0.06 | 0.001 | 0.1 |
| 92.00446262551137 | 0.034 | 0.057 | 0.001 | 0.1 |
| 92.1718110821867 | 0.036 | 0.053 | 0.001 | 0.101 |
| 92.33915953886203 | 0.033 | 0.052 | 0.002 | 0.1 |
| 92.49721085905541 | 0.033 | 0.048 | 0.002 | 0.098 |
| 92.66455931573077 | 0.033 | 0.045 | 0.002 | 0.1 |
| 92.83190777240611 | 0.033 | 0.044 | 0.004 | 0.101 |
| 92.99925622908145 | 0.033 | 0.044 | 0.005 | 0.102 |
| 93.1666046857568 | 0.032 | 0.043 | 0.006 | 0.104 |
| 93.33395314243214 | 0.032 | 0.042 | 0.006 | 0.108 |
| 93.50130159910749 | 0.032 | 0.038 | 0.006 | 0.111 |
| 93.66865005578283 | 0.033 | 0.036 | 0.005 | 0.112 |
| 93.83599851245818 | 0.033 | 0.033 | 0.004 | 0.114 |
| 94.00334696913353 | 0.033 | 0.034 | 0.005 | 0.117 |
| 94.17069542580886 | 0.034 | 0.034 | 0.005 | 0.118 |
| 94.3380438824842 | 0.034 | 0.034 | 0.006 | 0.119 |
| 94.50539233915954 | 0.034 | 0.032 | 0.006 | 0.12 |
| 94.66344365935292 | 0.034 | 0.028 | 0.007 | 0.122 |
| 94.83079211602828 | 0.036 | 0.025 | 0.006 | 0.125 |
| 94.99814057270362 | 0.034 | 0.025 | 0.006 | 0.129 |
| 95.16548902937897 | 0.034 | 0.027 | 0.006 | 0.131 |
| 95.33283748605432 | 0.034 | 0.026 | 0.006 | 0.134 |
| 95.50018594272963 | 0.036 | 0.022 | 0.006 | 0.136 |
| 95.66753439940499 | 0.037 | 0.02 | 0.005 | 0.141 |
| 95.83488285608034 | 0.037 | 0.029 | 0.004 | 0.151 |
| 96.00223131275567 | 0.037 | 0.038 | 0.002 | 0.162 |
| 96.16957976943102 | 0.038 | 0.044 | 0.001 | 0.17 |
| 96.33692822610638 | 0.038 | 0.047 | 0 | 0.172 |
| 96.50427668278171 | 0.038 | 0.047 | 0 | 0.174 |
| 96.67162513945706 | 0.038 | 0.047 | 0.001 | 0.173 |
| 96.8389735961324 | 0.038 | 0.044 | 0.001 | 0.172 |
| 96.99702491632577 | 0.039 | 0.041 | 0 | 0.173 |
| 97.16437337300111 | 0.041 | 0.038 | -0.001 | 0.174 |
| 97.33172182967647 | 0.041 | 0.039 | -0.001 | 0.174 |
| 97.49907028635181 | 0.039 | 0.038 | 0 | 0.171 |
| 97.66641874302715 | 0.039 | 0.038 | 0 | 0.171 |
| 97.8337671997025 | 0.039 | 0.037 | 0.001 | 0.17 |
| 98.00111565637785 | 0.039 | 0.034 | 0.001 | 0.168 |
| 98.16846411305319 | 0.041 | 0.033 | 0 | 0.168 |
| 98.33581256972855 | 0.041 | 0.029 | 0.001 | 0.167 |
| 98.50316102640389 | 0.039 | 0.028 | 0.002 | 0.163 |
| 98.67050948307921 | 0.036 | 0.029 | 0.004 | 0.162 |
| 98.83785793975456 | 0.037 | 0.028 | 0.002 | 0.161 |
| 99.0052063964299 | 0.037 | 0.027 | 0.002 | 0.162 |
| 99.17255485310525 | 0.034 | 0.028 | 0.002 | 0.163 |
| 99.33060617329863 | 0.034 | 0.029 | 0.001 | 0.163 |
| 99.49795462997399 | 0.033 | 0.032 | 0.002 | 0.162 |
| 99.66530308664933 | 0.033 | 0.033 | 0.002 | 0.161 |
| 99.83265154332467 | 0.033 | 0.032 | 0.001 | 0.161 |
| 100.0 | 0.036 | 0.031 | 0.001 | 0.161 |